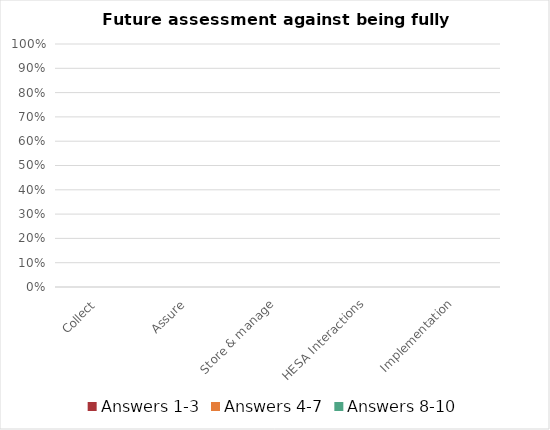
| Category | Answers 1-3 | Answers 4-7 | Answers 8-10 |
|---|---|---|---|
| Collect | 0 | 0 | 0 |
| Assure | 0 | 0 | 0 |
| Store & manage | 0 | 0 | 0 |
| HESA Interactions | 0 | 0 | 0 |
| Implementation | 0 | 0 | 0 |